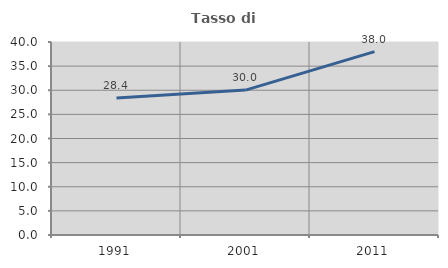
| Category | Tasso di occupazione   |
|---|---|
| 1991.0 | 28.404 |
| 2001.0 | 30.028 |
| 2011.0 | 38 |